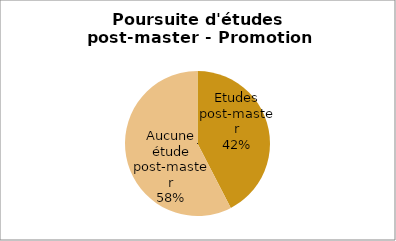
| Category | Promotion 2007 |
|---|---|
| Etudes post-master | 0.424 |
| Aucune étude post-master | 0.576 |